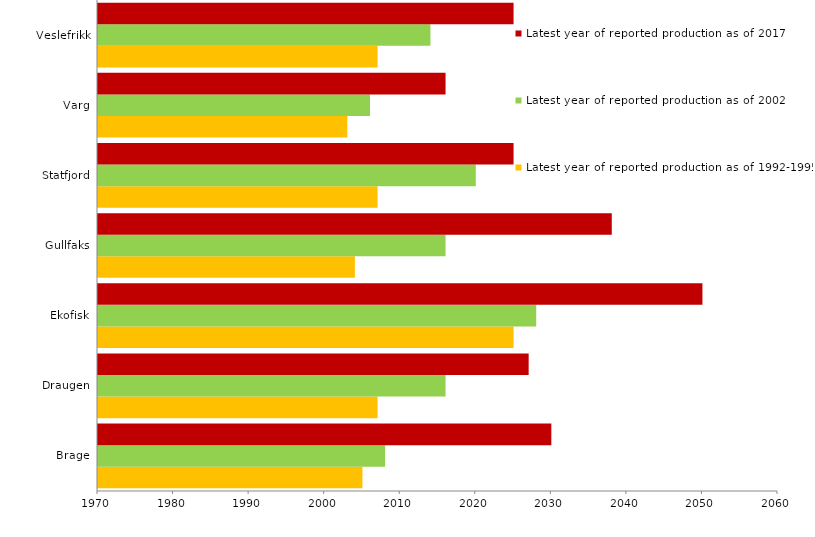
| Category | Latest year of reported production as of 1992-1995 | Latest year of reported production as of 2002 | Latest year of reported production as of 2017 |
|---|---|---|---|
| Brage | 2005 | 2008 | 2030 |
| Draugen | 2007 | 2016 | 2027 |
| Ekofisk | 2025 | 2028 | 2050 |
| Gullfaks | 2004 | 2016 | 2038 |
| Statfjord | 2007 | 2020 | 2025 |
| Varg | 2003 | 2006 | 2016 |
| Veslefrikk | 2007 | 2014 | 2025 |